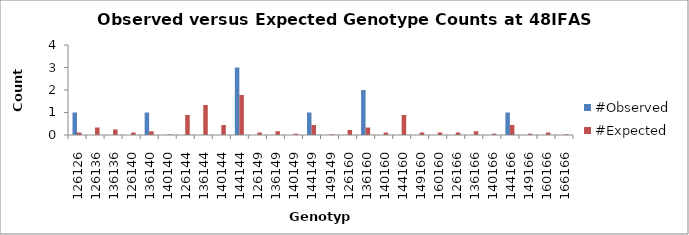
| Category | #Observed | #Expected |
|---|---|---|
| 126126.0 | 1 | 0.111 |
| 126136.0 | 0 | 0.333 |
| 136136.0 | 0 | 0.25 |
| 126140.0 | 0 | 0.111 |
| 136140.0 | 1 | 0.167 |
| 140140.0 | 0 | 0.028 |
| 126144.0 | 0 | 0.889 |
| 136144.0 | 0 | 1.333 |
| 140144.0 | 0 | 0.444 |
| 144144.0 | 3 | 1.778 |
| 126149.0 | 0 | 0.111 |
| 136149.0 | 0 | 0.167 |
| 140149.0 | 0 | 0.056 |
| 144149.0 | 1 | 0.444 |
| 149149.0 | 0 | 0.028 |
| 126160.0 | 0 | 0.222 |
| 136160.0 | 2 | 0.333 |
| 140160.0 | 0 | 0.111 |
| 144160.0 | 0 | 0.889 |
| 149160.0 | 0 | 0.111 |
| 160160.0 | 0 | 0.111 |
| 126166.0 | 0 | 0.111 |
| 136166.0 | 0 | 0.167 |
| 140166.0 | 0 | 0.056 |
| 144166.0 | 1 | 0.444 |
| 149166.0 | 0 | 0.056 |
| 160166.0 | 0 | 0.111 |
| 166166.0 | 0 | 0.028 |